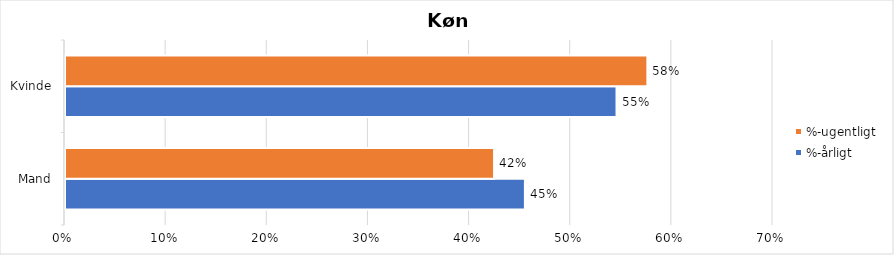
| Category | %-årligt | %-ugentligt |
|---|---|---|
| Mand | 0.455 | 0.424 |
| Kvinde | 0.545 | 0.576 |